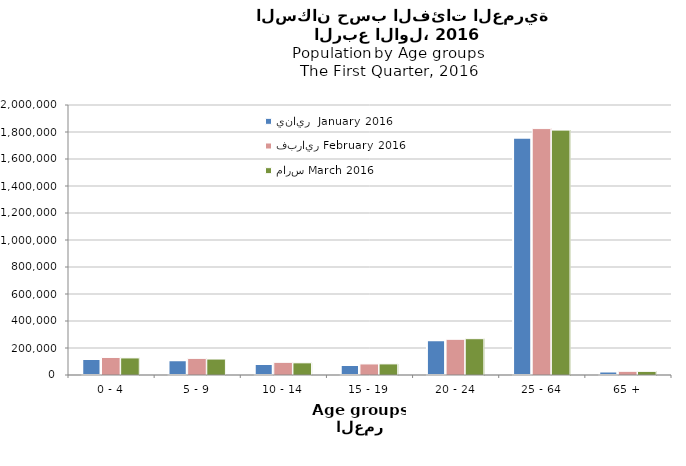
| Category | يناير  January 2016 | فبراير February 2016  | مارس March 2016  |
|---|---|---|---|
| 0 - 4 | 118216 | 129910 | 126541 |
| 5 - 9 | 108510 | 123042 | 118252 |
| 10 - 14 | 81439 | 93789 | 90193 |
| 15 - 19 | 73258 | 81886 | 82253 |
| 20 - 24 | 257697 | 264415 | 268890 |
| 25 - 64 | 1757900 | 1825260 | 1813974 |
| 65 + | 26155 | 27301 | 26891 |